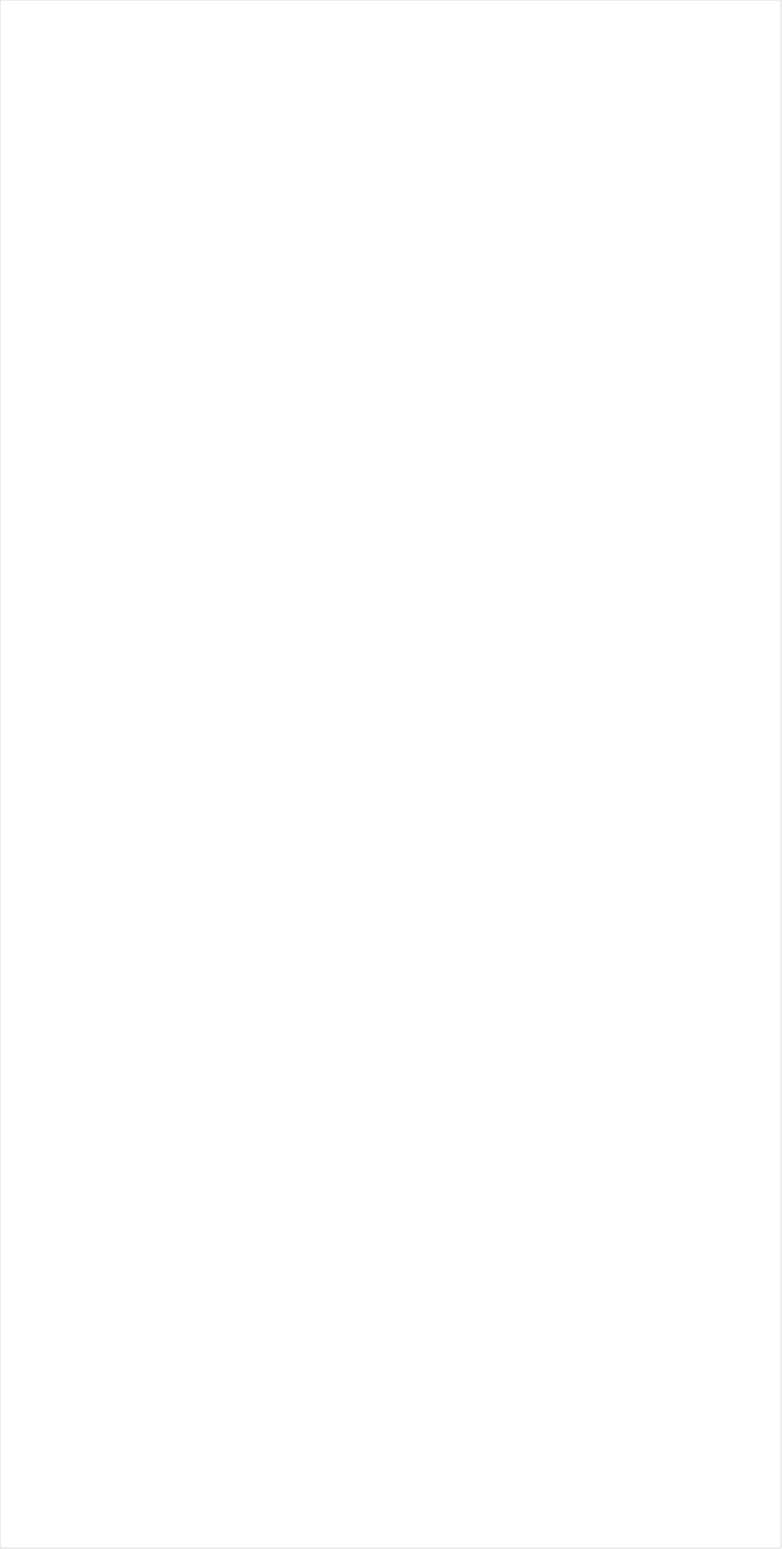
| Category | Total |
|---|---|
| Fox Business | -0.176 |
| INSP | -0.167 |
| Hallmark Movies & Mysteries | -0.155 |
| PBS | -0.152 |
| RFD TV | -0.152 |
| MSNBC | -0.123 |
| Discovery Life Channel | -0.11 |
| Hallmark | -0.107 |
| Fox News | -0.094 |
| SundanceTV | -0.094 |
| Smithsonian | -0.091 |
| Weather Channel | -0.091 |
| Tennis Channel | -0.087 |
| CBS | -0.078 |
| Bloomberg HD | -0.071 |
| UP TV | -0.071 |
| TV LAND | -0.06 |
| WGN America | -0.058 |
| Outdoor Channel | -0.051 |
| Olympic Channel | -0.044 |
| American Heroes Channel | -0.042 |
| National Geographic Wild | -0.04 |
| Great American Country | -0.04 |
| Golf | -0.039 |
| The Sportsman Channel | -0.036 |
| ION | -0.036 |
| CNN | -0.035 |
| NBC | -0.035 |
| Game Show | -0.034 |
| ABC | -0.032 |
| Science Channel | -0.029 |
| CNBC | -0.028 |
| FOX Sports 2 | -0.027 |
| FXDEP | -0.025 |
| Animal Planet | -0.024 |
| History Channel | -0.023 |
| Headline News | -0.022 |
| Ovation | -0.022 |
| CBS Sports | -0.02 |
| HGTV | -0.018 |
| Big Ten Network | -0.017 |
| National Geographic | -0.013 |
| DIY | -0.012 |
| POP | -0.01 |
| OXYGEN | -0.009 |
| BBC America | -0.008 |
| FYI | -0.004 |
| Fox Sports 1 | -0.004 |
| USA Network | 0.002 |
| CW | 0.004 |
| truTV | 0.004 |
| TBS | 0.009 |
| FOX | 0.011 |
| Disney Junior US | 0.011 |
| TNT | 0.013 |
| Motor Trend Network | 0.013 |
| Galavision | 0.014 |
| Oprah Winfrey Network | 0.014 |
| NBC Sports | 0.014 |
| CMTV | 0.014 |
| Nick Jr. | 0.015 |
| NBC Universo | 0.017 |
| Lifetime Movies | 0.02 |
| Universal Kids | 0.021 |
| Travel | 0.023 |
| AMC | 0.023 |
| Investigation Discovery | 0.023 |
| TLC | 0.024 |
| WE TV | 0.025 |
| NFL Network | 0.026 |
| Food Network | 0.026 |
| SYFY | 0.027 |
| Discovery Channel | 0.027 |
| Destination America | 0.032 |
| Paramount Network | 0.032 |
| FX Movie Channel | 0.033 |
| Lifetime | 0.035 |
| MyNetworkTV | 0.036 |
| Independent Film (IFC) | 0.036 |
| A&E | 0.037 |
| UniMas | 0.039 |
| Cooking Channel | 0.043 |
| Reelz Channel | 0.048 |
| FX | 0.048 |
| E! | 0.049 |
| NBA TV | 0.049 |
| Adult Swim | 0.049 |
| BET Her | 0.051 |
| Discovery Family Channel | 0.051 |
| ESPNEWS | 0.053 |
| Univision | 0.053 |
| MLB Network | 0.054 |
| BRAVO | 0.056 |
| Telemundo | 0.057 |
| MTV | 0.057 |
| ESPN | 0.058 |
| FXX | 0.061 |
| Freeform | 0.062 |
| ESPN Deportes | 0.067 |
| ESPN2 | 0.072 |
| Logo | 0.078 |
| TUDN | 0.078 |
| PAC-12 Network | 0.081 |
| BET | 0.081 |
| VH1 | 0.084 |
| NHL | 0.084 |
| Nick@Nite | 0.085 |
| Viceland | 0.085 |
| Comedy Central | 0.089 |
| MTV2 | 0.09 |
| Nick | 0.094 |
| TV ONE | 0.113 |
| ESPNU | 0.114 |
| Teen Nick | 0.115 |
| Cartoon Network | 0.141 |
| Disney Channel | 0.142 |
| Disney XD | 0.147 |
| Nick Toons | 0.147 |